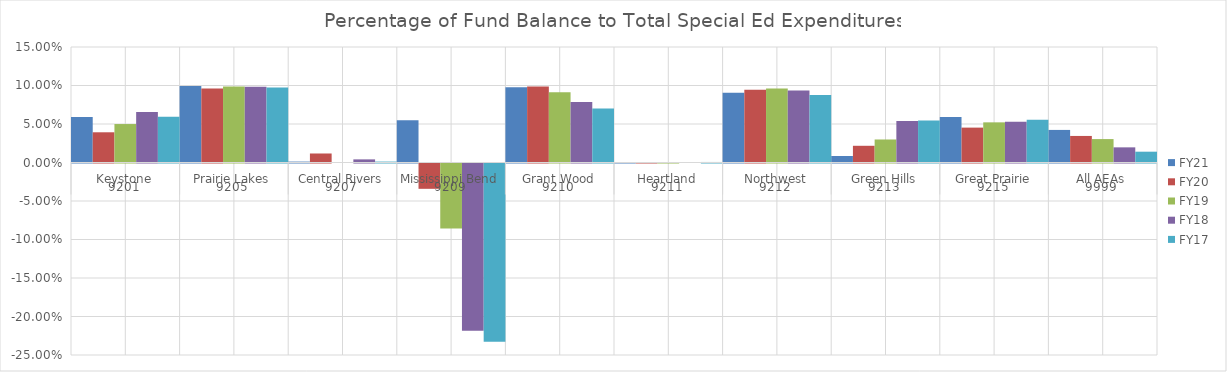
| Category | FY21 | FY20 | FY19 | FY18 | FY17 |
|---|---|---|---|---|---|
| 0 | 0.059 | 0.039 | 0.05 | 0.066 | 0.06 |
| 1 | 0.099 | 0.096 | 0.099 | 0.098 | 0.097 |
| 2 | 0.001 | 0.012 | 0 | 0.004 | 0.001 |
| 3 | 0.055 | -0.033 | -0.084 | -0.217 | -0.231 |
| 4 | 0.098 | 0.099 | 0.091 | 0.079 | 0.07 |
| 5 | 0 | 0 | 0 | 0 | 0.001 |
| 6 | 0.091 | 0.095 | 0.096 | 0.094 | 0.088 |
| 7 | 0.008 | 0.022 | 0.03 | 0.054 | 0.055 |
| 8 | 0.059 | 0.045 | 0.052 | 0.053 | 0.055 |
| 9 | 0.042 | 0.034 | 0.03 | 0.02 | 0.014 |